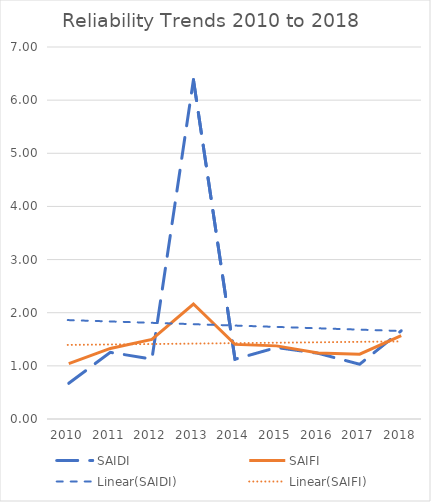
| Category | SAIDI | SAIFI |
|---|---|---|
| 2010.0 | 0.672 | 1.041 |
| 2011.0 | 1.255 | 1.328 |
| 2012.0 | 1.126 | 1.498 |
| 2013.0 | 6.382 | 2.164 |
| 2014.0 | 1.124 | 1.404 |
| 2015.0 | 1.345 | 1.376 |
| 2016.0 | 1.237 | 1.242 |
| 2017.0 | 1.03 | 1.22 |
| 2018.0 | 1.66 | 1.57 |